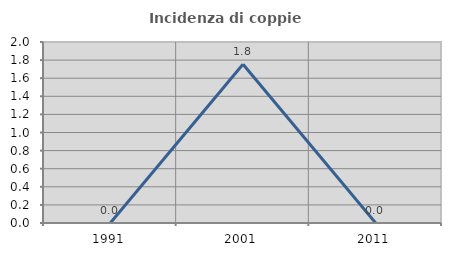
| Category | Incidenza di coppie miste |
|---|---|
| 1991.0 | 0 |
| 2001.0 | 1.754 |
| 2011.0 | 0 |